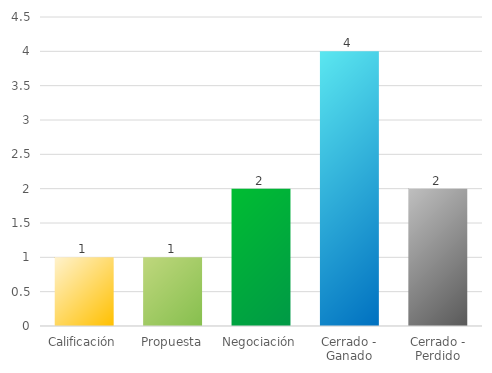
| Category | Series 0 |
|---|---|
| Calificación | 1 |
| Propuesta | 1 |
| Negociación | 2 |
| Cerrado - Ganado | 4 |
| Cerrado - Perdido | 2 |